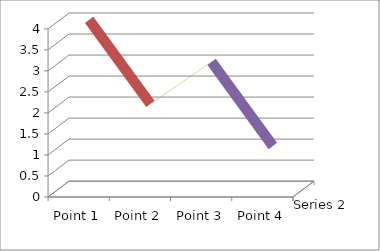
| Category | Series 2 |
|---|---|
| Point 1 | 4 |
| Point 2 | 2 |
| Point 3 | 3 |
| Point 4 | 1 |